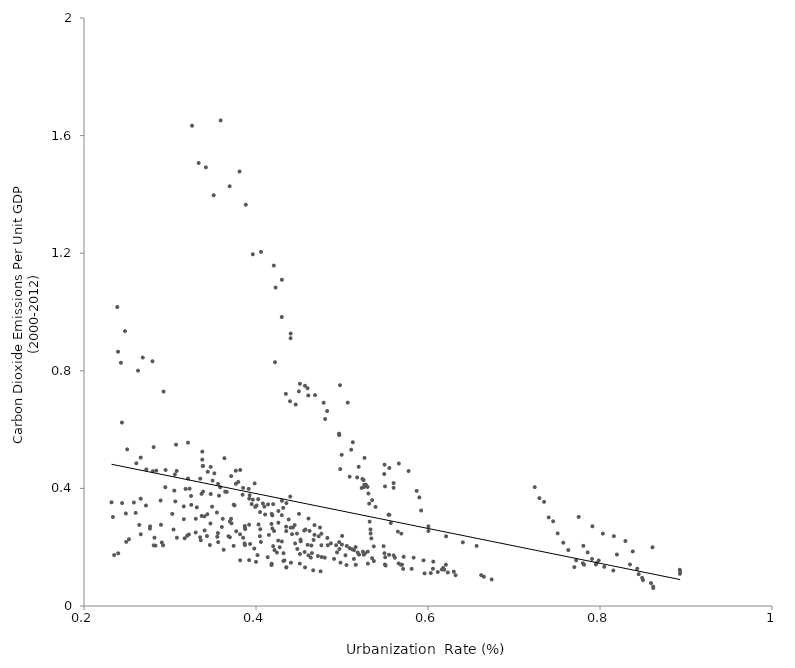
| Category | co2pergdp |
|---|---|
| 0.232 | 0.353 |
| 0.233577 | 0.303 |
| 0.2351077 | 0.173 |
| 0.2386821 | 1.017 |
| 0.2395683 | 0.865 |
| 0.2398116 | 0.179 |
| 0.2429268 | 0.827 |
| 0.2440994 | 0.624 |
| 0.2443 | 0.35 |
| 0.2476796 | 0.935 |
| 0.2486587 | 0.315 |
| 0.2490785 | 0.218 |
| 0.2501744 | 0.533 |
| 0.2523181 | 0.227 |
| 0.257984 | 0.352 |
| 0.2600969 | 0.317 |
| 0.2608631 | 0.485 |
| 0.2627792 | 0.801 |
| 0.2642574 | 0.276 |
| 0.2659146 | 0.505 |
| 0.2659735 | 0.365 |
| 0.2660387 | 0.244 |
| 0.2683646 | 0.845 |
| 0.2720596 | 0.342 |
| 0.2724287 | 0.464 |
| 0.2766964 | 0.263 |
| 0.2768619 | 0.271 |
| 0.2795994 | 0.832 |
| 0.2799934 | 0.459 |
| 0.2809578 | 0.541 |
| 0.2810192 | 0.206 |
| 0.2819549 | 0.232 |
| 0.2830776 | 0.205 |
| 0.2840386 | 0.461 |
| 0.289081 | 0.359 |
| 0.2894906 | 0.276 |
| 0.2905085 | 0.216 |
| 0.291972 | 0.206 |
| 0.2925079 | 0.729 |
| 0.2944989 | 0.404 |
| 0.2948564 | 0.463 |
| 0.3026288 | 0.313 |
| 0.304085 | 0.26 |
| 0.305 | 0.393 |
| 0.3057092 | 0.447 |
| 0.3061834 | 0.356 |
| 0.3070255 | 0.549 |
| 0.3077676 | 0.459 |
| 0.3080049 | 0.232 |
| 0.316 | 0.339 |
| 0.316098 | 0.295 |
| 0.3170382 | 0.23 |
| 0.3181019 | 0.398 |
| 0.3199759 | 0.239 |
| 0.3209562 | 0.556 |
| 0.3209635 | 0.434 |
| 0.3220275 | 0.243 |
| 0.3227223 | 0.399 |
| 0.3244546 | 0.374 |
| 0.3247 | 0.344 |
| 0.3256137 | 1.634 |
| 0.3298831 | 0.25 |
| 0.33 | 0.297 |
| 0.3312193 | 0.336 |
| 0.3333392 | 1.507 |
| 0.3349902 | 0.234 |
| 0.3352046 | 0.433 |
| 0.3358369 | 0.224 |
| 0.3367096 | 0.381 |
| 0.3367819 | 0.306 |
| 0.337532 | 0.498 |
| 0.3375771 | 0.525 |
| 0.3380282 | 0.476 |
| 0.3384357 | 0.477 |
| 0.3384715 | 0.389 |
| 0.34 | 0.305 |
| 0.340221 | 0.257 |
| 0.3417308 | 1.492 |
| 0.343 | 0.238 |
| 0.3434 | 0.312 |
| 0.3439038 | 0.456 |
| 0.3464 | 0.207 |
| 0.347023 | 0.281 |
| 0.3472727 | 0.473 |
| 0.3473512 | 0.381 |
| 0.3489082 | 0.338 |
| 0.3495718 | 0.427 |
| 0.3508252 | 1.397 |
| 0.3515588 | 0.451 |
| 0.3545752 | 0.318 |
| 0.3549836 | 0.235 |
| 0.3557656 | 0.248 |
| 0.3558722 | 0.415 |
| 0.356 | 0.217 |
| 0.3570261 | 0.375 |
| 0.3583492 | 0.404 |
| 0.3588851 | 1.651 |
| 0.3603 | 0.269 |
| 0.3613281 | 0.296 |
| 0.3624 | 0.191 |
| 0.3632887 | 0.503 |
| 0.3641 | 0.389 |
| 0.3659332 | 0.388 |
| 0.3679841 | 0.237 |
| 0.3693621 | 1.428 |
| 0.3695858 | 0.287 |
| 0.3696266 | 0.234 |
| 0.371 | 0.297 |
| 0.3711592 | 0.442 |
| 0.3715275 | 0.281 |
| 0.374 | 0.205 |
| 0.3740261 | 0.345 |
| 0.3750677 | 0.342 |
| 0.3764839 | 0.46 |
| 0.3765874 | 0.416 |
| 0.3770423 | 0.254 |
| 0.3794 | 0.422 |
| 0.3808743 | 1.478 |
| 0.3814838 | 0.244 |
| 0.3816 | 0.155 |
| 0.3816479 | 0.463 |
| 0.3844 | 0.378 |
| 0.3849907 | 0.402 |
| 0.385008 | 0.232 |
| 0.3868115 | 0.213 |
| 0.387 | 0.272 |
| 0.387 | 0.207 |
| 0.3871 | 0.266 |
| 0.3875 | 0.261 |
| 0.3881412 | 1.365 |
| 0.3915 | 0.398 |
| 0.392 | 0.277 |
| 0.392 | 0.156 |
| 0.392081 | 0.365 |
| 0.3926 | 0.377 |
| 0.3931 | 0.211 |
| 0.3950073 | 0.347 |
| 0.3963118 | 1.196 |
| 0.3963628 | 0.362 |
| 0.398 | 0.195 |
| 0.3984317 | 0.417 |
| 0.3991187 | 0.337 |
| 0.4 | 0.15 |
| 0.4007 | 0.342 |
| 0.4017402 | 0.173 |
| 0.4025637 | 0.363 |
| 0.403 | 0.277 |
| 0.4045 | 0.237 |
| 0.4047113 | 0.32 |
| 0.405 | 0.261 |
| 0.4057 | 0.218 |
| 0.4057993 | 1.204 |
| 0.4080064 | 0.349 |
| 0.4097473 | 0.338 |
| 0.4105819 | 0.311 |
| 0.4136 | 0.166 |
| 0.4139986 | 0.346 |
| 0.4150143 | 0.242 |
| 0.418 | 0.279 |
| 0.418 | 0.139 |
| 0.4183 | 0.144 |
| 0.4183124 | 0.313 |
| 0.4189892 | 0.308 |
| 0.4190332 | 0.264 |
| 0.4199413 | 0.204 |
| 0.42 | 0.346 |
| 0.4207034 | 1.158 |
| 0.421 | 0.255 |
| 0.4215 | 0.19 |
| 0.4220489 | 0.829 |
| 0.4228188 | 1.083 |
| 0.4243 | 0.182 |
| 0.4257644 | 0.223 |
| 0.4259822 | 0.283 |
| 0.4259916 | 0.323 |
| 0.4275762 | 0.2 |
| 0.43 | 0.983 |
| 0.4300244 | 0.309 |
| 0.4300823 | 0.22 |
| 0.4301 | 1.11 |
| 0.4302059 | 0.358 |
| 0.4316988 | 0.334 |
| 0.4318154 | 0.153 |
| 0.432 | 0.18 |
| 0.4330289 | 0.155 |
| 0.4347333 | 0.721 |
| 0.435 | 0.27 |
| 0.4351665 | 0.255 |
| 0.4353 | 0.131 |
| 0.4353 | 0.131 |
| 0.4353428 | 0.35 |
| 0.438 | 0.294 |
| 0.4395554 | 0.696 |
| 0.4398 | 0.372 |
| 0.4402 | 0.911 |
| 0.4402522 | 0.267 |
| 0.4403 | 0.927 |
| 0.4406096 | 0.147 |
| 0.4419071 | 0.244 |
| 0.443 | 0.267 |
| 0.4449541 | 0.275 |
| 0.4454888 | 0.213 |
| 0.4461861 | 0.685 |
| 0.4476021 | 0.246 |
| 0.448 | 0.194 |
| 0.4498382 | 0.73 |
| 0.45 | 0.313 |
| 0.4509726 | 0.144 |
| 0.4510484 | 0.756 |
| 0.4510749 | 0.177 |
| 0.4517513 | 0.226 |
| 0.452 | 0.22 |
| 0.4560144 | 0.257 |
| 0.4565593 | 0.184 |
| 0.4569578 | 0.749 |
| 0.4570445 | 0.131 |
| 0.4575636 | 0.26 |
| 0.4599483 | 0.741 |
| 0.46 | 0.208 |
| 0.4608 | 0.716 |
| 0.461 | 0.298 |
| 0.461 | 0.172 |
| 0.4623383 | 0.256 |
| 0.463735 | 0.165 |
| 0.4644275 | 0.206 |
| 0.465 | 0.18 |
| 0.4665 | 0.121 |
| 0.467 | 0.225 |
| 0.468 | 0.242 |
| 0.468 | 0.275 |
| 0.4686642 | 0.717 |
| 0.472 | 0.17 |
| 0.4729494 | 0.237 |
| 0.4744 | 0.267 |
| 0.4751 | 0.118 |
| 0.476 | 0.246 |
| 0.4760042 | 0.207 |
| 0.4763389 | 0.167 |
| 0.478673 | 0.691 |
| 0.48 | 0.164 |
| 0.4804141 | 0.636 |
| 0.4827746 | 0.663 |
| 0.483 | 0.231 |
| 0.4834 | 0.207 |
| 0.4869915 | 0.213 |
| 0.4907407 | 0.16 |
| 0.4931471 | 0.207 |
| 0.4942367 | 0.182 |
| 0.4965449 | 0.586 |
| 0.4966701 | 0.217 |
| 0.4968 | 0.581 |
| 0.4970321 | 0.194 |
| 0.4976526 | 0.751 |
| 0.4979562 | 0.466 |
| 0.4982739 | 0.148 |
| 0.4996271 | 0.514 |
| 0.4999 | 0.209 |
| 0.5002 | 0.238 |
| 0.5040447 | 0.172 |
| 0.5051958 | 0.139 |
| 0.5055847 | 0.204 |
| 0.5067 | 0.692 |
| 0.5088922 | 0.44 |
| 0.509 | 0.197 |
| 0.5106955 | 0.532 |
| 0.5118142 | 0.193 |
| 0.5126 | 0.557 |
| 0.5138428 | 0.16 |
| 0.5140829 | 0.19 |
| 0.5159 | 0.201 |
| 0.516 | 0.14 |
| 0.5176405 | 0.437 |
| 0.518255 | 0.182 |
| 0.5194116 | 0.474 |
| 0.5197921 | 0.175 |
| 0.5228867 | 0.401 |
| 0.5237995 | 0.432 |
| 0.5243 | 0.185 |
| 0.5250368 | 0.428 |
| 0.5252492 | 0.174 |
| 0.5257015 | 0.404 |
| 0.5258978 | 0.412 |
| 0.5261942 | 0.504 |
| 0.5266761 | 0.179 |
| 0.5277705 | 0.413 |
| 0.5297 | 0.405 |
| 0.5299827 | 0.185 |
| 0.5300907 | 0.144 |
| 0.5307225 | 0.383 |
| 0.5316 | 0.348 |
| 0.5321 | 0.287 |
| 0.5331124 | 0.261 |
| 0.533309 | 0.247 |
| 0.5340797 | 0.23 |
| 0.535 | 0.36 |
| 0.535 | 0.163 |
| 0.537 | 0.203 |
| 0.5370747 | 0.153 |
| 0.539 | 0.337 |
| 0.5483515 | 0.204 |
| 0.5491178 | 0.449 |
| 0.5493889 | 0.179 |
| 0.5494742 | 0.481 |
| 0.5499488 | 0.141 |
| 0.5499881 | 0.407 |
| 0.5502 | 0.166 |
| 0.5507365 | 0.138 |
| 0.5540565 | 0.311 |
| 0.5547516 | 0.174 |
| 0.555 | 0.31 |
| 0.5550162 | 0.469 |
| 0.556744 | 0.282 |
| 0.5599952 | 0.418 |
| 0.56 | 0.402 |
| 0.5600701 | 0.172 |
| 0.5614588 | 0.164 |
| 0.565 | 0.253 |
| 0.5658327 | 0.145 |
| 0.5661339 | 0.484 |
| 0.5684648 | 0.141 |
| 0.569 | 0.246 |
| 0.5698 | 0.14 |
| 0.5710804 | 0.126 |
| 0.571722 | 0.167 |
| 0.5774 | 0.459 |
| 0.581 | 0.126 |
| 0.583295 | 0.164 |
| 0.5868278 | 0.392 |
| 0.5899 | 0.369 |
| 0.592 | 0.325 |
| 0.594777 | 0.155 |
| 0.596 | 0.111 |
| 0.6004415 | 0.255 |
| 0.6004583 | 0.271 |
| 0.6032075 | 0.112 |
| 0.6057949 | 0.127 |
| 0.6061562 | 0.151 |
| 0.6113447 | 0.116 |
| 0.616119 | 0.124 |
| 0.6176085 | 0.129 |
| 0.6189843 | 0.123 |
| 0.6207922 | 0.14 |
| 0.6210285 | 0.237 |
| 0.623 | 0.114 |
| 0.63 | 0.117 |
| 0.632 | 0.105 |
| 0.6405 | 0.217 |
| 0.6565 | 0.204 |
| 0.661814 | 0.105 |
| 0.6649904 | 0.099 |
| 0.674 | 0.09 |
| 0.7241059 | 0.404 |
| 0.7295791 | 0.367 |
| 0.7349834 | 0.354 |
| 0.7403182 | 0.301 |
| 0.7455828 | 0.288 |
| 0.7507766 | 0.247 |
| 0.7573 | 0.215 |
| 0.7631 | 0.19 |
| 0.7701384 | 0.132 |
| 0.7723 | 0.155 |
| 0.7752199 | 0.303 |
| 0.7802016 | 0.145 |
| 0.7806498 | 0.205 |
| 0.7814925 | 0.141 |
| 0.7856641 | 0.182 |
| 0.790728 | 0.16 |
| 0.7911747 | 0.271 |
| 0.7951775 | 0.141 |
| 0.7959969 | 0.146 |
| 0.7984719 | 0.155 |
| 0.8033573 | 0.246 |
| 0.805 | 0.133 |
| 0.8155 | 0.121 |
| 0.8161121 | 0.238 |
| 0.8197072 | 0.175 |
| 0.8295583 | 0.221 |
| 0.8348504 | 0.141 |
| 0.8380952 | 0.186 |
| 0.8433 | 0.127 |
| 0.845 | 0.108 |
| 0.849 | 0.096 |
| 0.85 | 0.088 |
| 0.8593272 | 0.078 |
| 0.8610354 | 0.2 |
| 0.8618292 | 0.066 |
| 0.862 | 0.061 |
| 0.8927486 | 0.123 |
| 0.893 | 0.11 |
| 0.893175 | 0.117 |